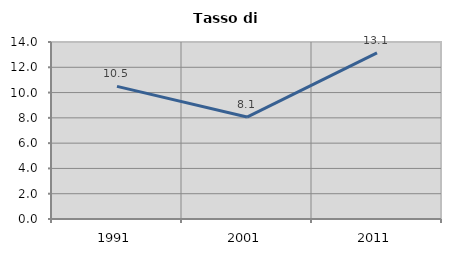
| Category | Tasso di disoccupazione   |
|---|---|
| 1991.0 | 10.49 |
| 2001.0 | 8.065 |
| 2011.0 | 13.139 |